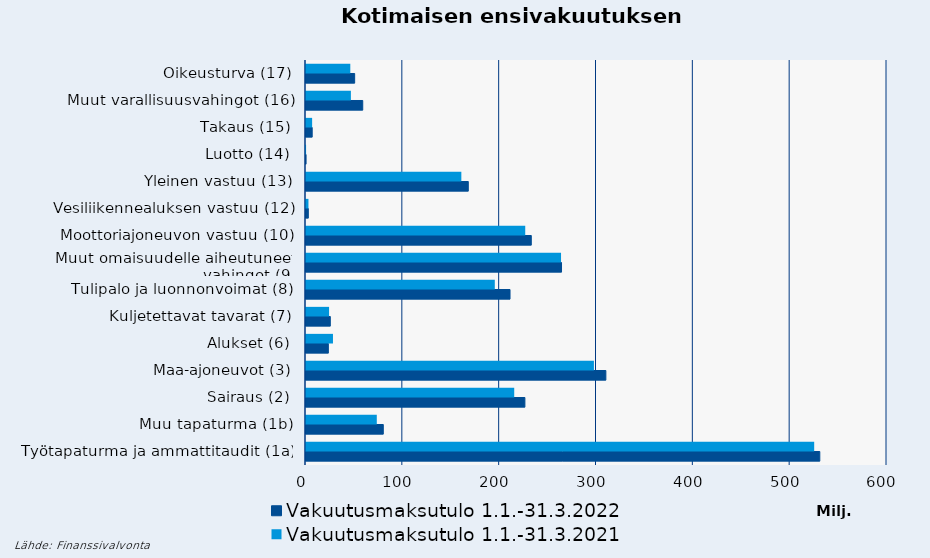
| Category | Vakuutusmaksutulo |
|---|---|
| Työtapaturma ja ammattitaudit (1a) | 524808.173 |
| Muu tapaturma (1b) | 73111.188 |
| Sairaus (2) | 215034.143 |
| Maa-ajoneuvot (3) | 297332.108 |
| Alukset (6) | 27853.436 |
| Kuljetettavat tavarat (7) | 23821.282 |
| Tulipalo ja luonnonvoimat (8) | 194974.919 |
| Muut omaisuudelle aiheutuneet 
vahingot (9) | 263378.092 |
| Moottoriajoneuvon vastuu (10) | 226410.398 |
| Vesiliikennealuksen vastuu (12) | 2539.575 |
| Yleinen vastuu (13) | 160427.687 |
| Luotto (14) | 78.734 |
| Takaus (15) | 6327.361 |
| Muut varallisuusvahingot (16) | 46359.449 |
| Oikeusturva (17) | 45748.894 |